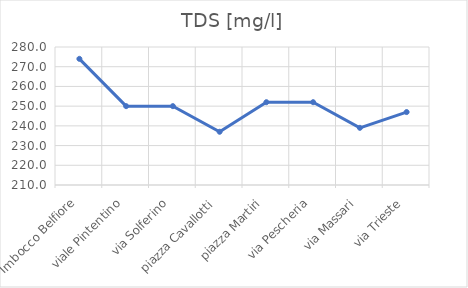
| Category | TDS [mg/l] |
|---|---|
| Imbocco Belfiore | 274 |
| viale Pintentino | 250 |
| via Solferino | 250 |
| piazza Cavallotti | 237 |
| piazza Martiri | 252 |
| via Pescheria | 252 |
| via Massari | 239 |
| via Trieste | 247 |